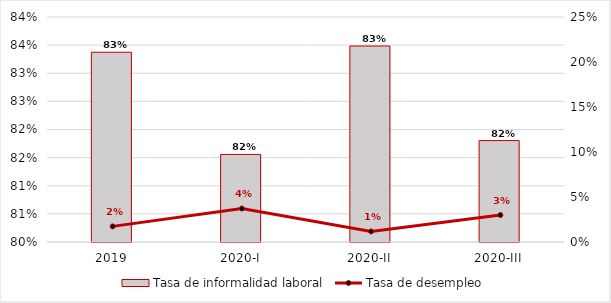
| Category | Tasa de informalidad laboral |
|---|---|
| 2019 | 0.834 |
| 2020-I | 0.816 |
| 2020-II | 0.835 |
| 2020-III | 0.818 |